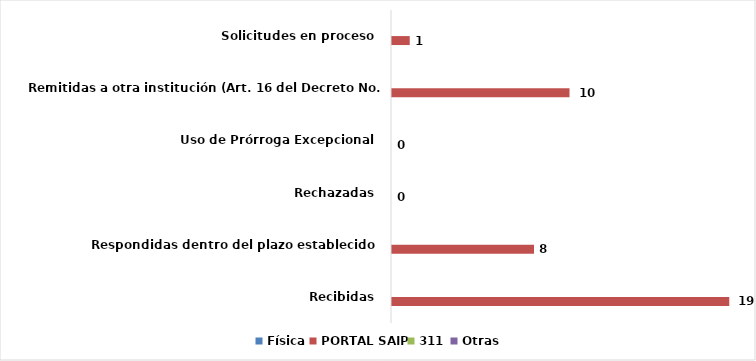
| Category | Física | PORTAL SAIP | 311 | Otras |
|---|---|---|---|---|
| Recibidas  | 0 | 19 | 0 | 0 |
| Respondidas dentro del plazo establecido  | 0 | 8 | 0 | 0 |
| Rechazadas  | 0 | 0 | 0 | 0 |
| Uso de Prórroga Excepcional  | 0 | 0 | 0 | 0 |
| Remitidas a otra institución (Art. 16 del Decreto No. 130-05)  | 0 | 10 | 0 | 0 |
| Solicitudes en proceso  | 0 | 1 | 0 | 0 |